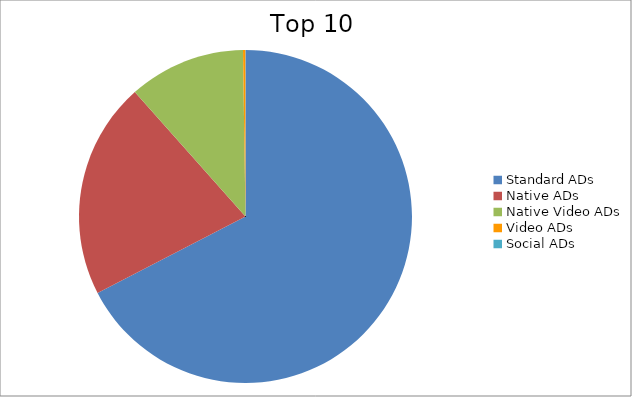
| Category | Series 0 |
|---|---|
| Standard ADs | 67.41 |
| Native ADs | 21.02 |
| Native Video ADs | 11.33 |
| Video ADs | 0.23 |
| Social ADs | 0.01 |